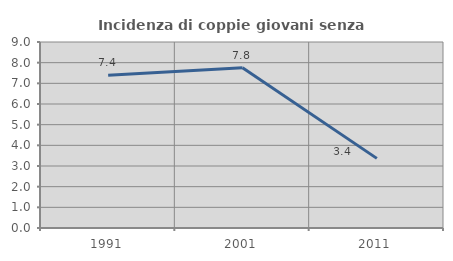
| Category | Incidenza di coppie giovani senza figli |
|---|---|
| 1991.0 | 7.394 |
| 2001.0 | 7.756 |
| 2011.0 | 3.369 |